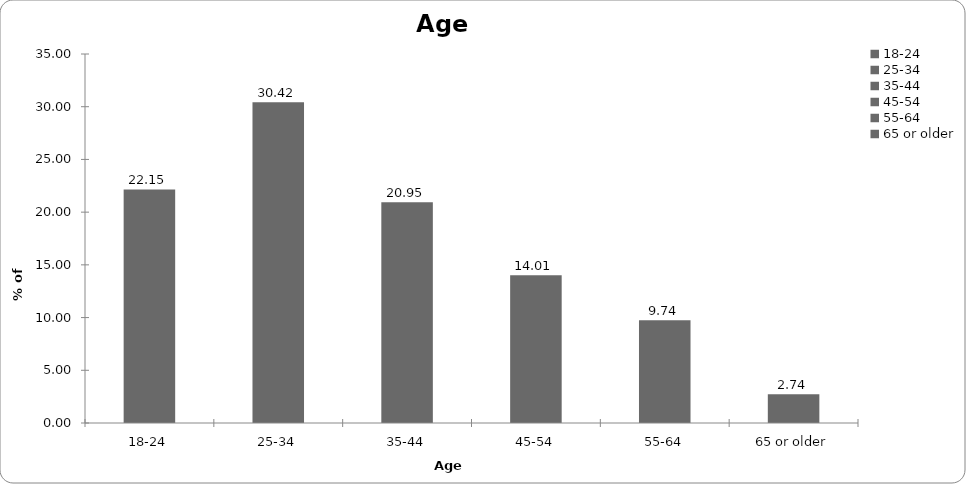
| Category | Age range |
|---|---|
| 18-24 | 22.148 |
| 25-34 | 30.42 |
| 35-44 | 20.947 |
| 45-54 | 14.009 |
| 55-64 | 9.74 |
| 65 or older | 2.735 |